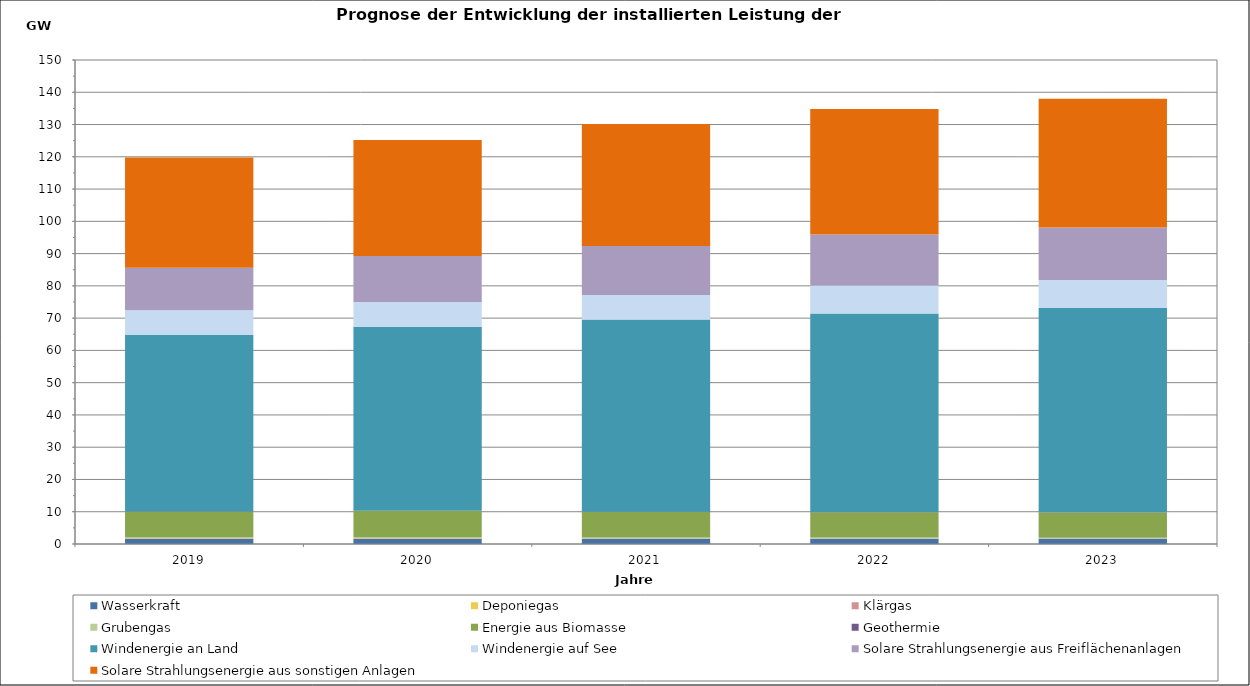
| Category | Wasserkraft | Deponiegas | Klärgas | Grubengas | Energie aus Biomasse | Geothermie | Windenergie an Land | Windenergie auf See | Solare Strahlungsenergie aus Freiflächenanlagen | Solare Strahlungsenergie aus sonstigen Anlagen |
|---|---|---|---|---|---|---|---|---|---|---|
| 2019 | 1617.52 | 172.56 | 95.27 | 232.76 | 7875 | 47.21 | 54711.79 | 7659 | 13240.73 | 34151.29 |
| 2020 | 1629.11 | 171.52 | 95.97 | 231.76 | 8149.14 | 51.11 | 57038.59 | 7659 | 14212.16 | 35970.98 |
| 2021 | 1640.7 | 77.08 | 96.67 | 198.69 | 7899.28 | 55.02 | 59570.29 | 7659 | 15126.4 | 37837.86 |
| 2022 | 1652.29 | 55.43 | 97.37 | 179.1 | 7838.37 | 58.92 | 61532.46 | 8716.9 | 15796.06 | 38876.01 |
| 2023 | 1663.88 | 52.31 | 98.07 | 110.38 | 7837.91 | 62.82 | 63302 | 8716.9 | 16271.28 | 39908.02 |